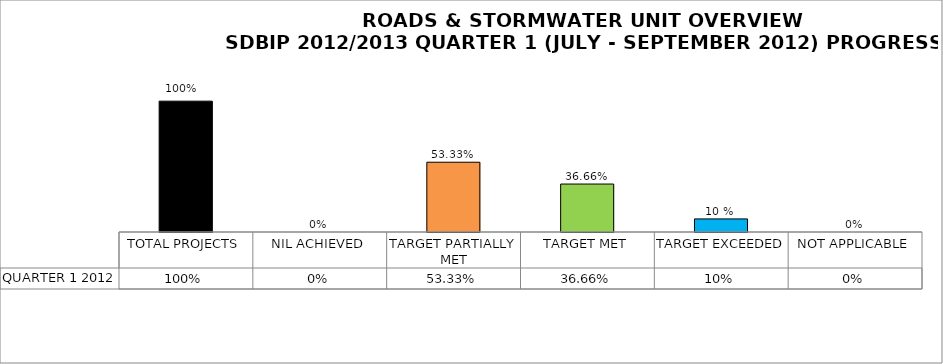
| Category | QUARTER 1 2012 |
|---|---|
| TOTAL PROJECTS | 1 |
| NIL ACHIEVED | 0 |
| TARGET PARTIALLY MET | 0.533 |
| TARGET MET | 0.367 |
| TARGET EXCEEDED | 0.1 |
| NOT APPLICABLE | 0 |